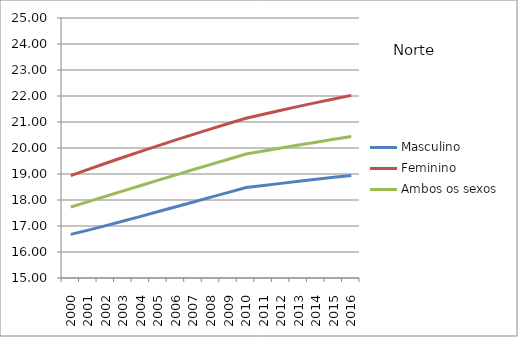
| Category | Masculino | Feminino | Ambos os sexos |
|---|---|---|---|
| 2000.0 | 16.679 | 18.934 | 17.732 |
| 2001.0 | 16.842 | 19.177 | 17.936 |
| 2002.0 | 17.014 | 19.414 | 18.144 |
| 2003.0 | 17.191 | 19.645 | 18.351 |
| 2004.0 | 17.372 | 19.872 | 18.558 |
| 2005.0 | 17.555 | 20.094 | 18.764 |
| 2006.0 | 17.739 | 20.311 | 18.968 |
| 2007.0 | 17.924 | 20.526 | 19.171 |
| 2008.0 | 18.109 | 20.736 | 19.372 |
| 2009.0 | 18.294 | 20.942 | 19.57 |
| 2010.0 | 18.481 | 21.144 | 19.767 |
| 2011.0 | 18.561 | 21.3 | 19.884 |
| 2012.0 | 18.64 | 21.453 | 19.999 |
| 2013.0 | 18.718 | 21.601 | 20.112 |
| 2014.0 | 18.795 | 21.746 | 20.224 |
| 2015.0 | 18.871 | 21.887 | 20.332 |
| 2016.0 | 18.947 | 22.024 | 20.439 |